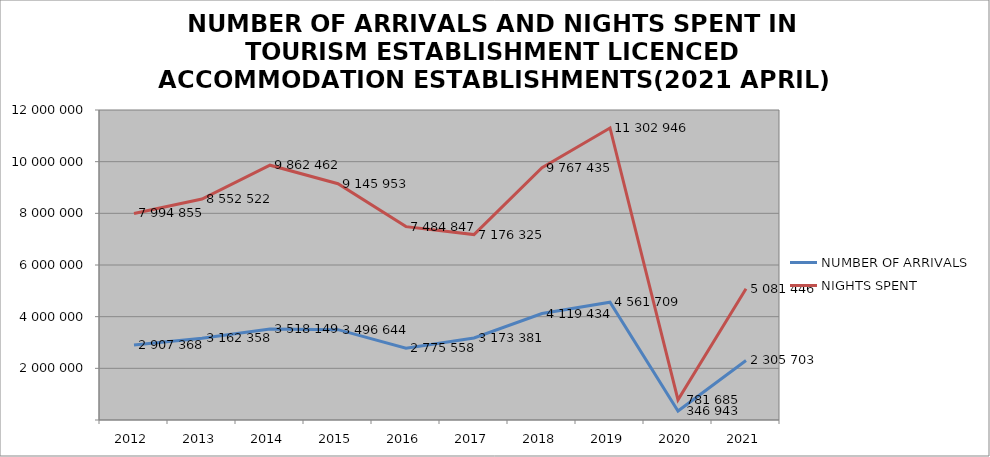
| Category | NUMBER OF ARRIVALS | NIGHTS SPENT |
|---|---|---|
| 2012 | 2907368 | 7994855 |
| 2013 | 3162358 | 8552522 |
| 2014 | 3518149 | 9862462 |
| 2015 | 3496644 | 9145953 |
| 2016 | 2775558 | 7484847 |
| 2017 | 3173381 | 7176325 |
| 2018 | 4119434 | 9767435 |
| 2019 | 4561709 | 11302946 |
| 2020 | 346943 | 781685 |
| 2021 | 2305703 | 5081446 |